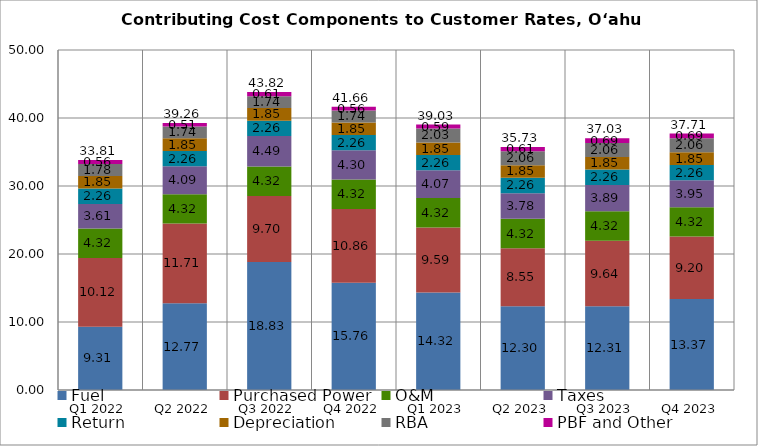
| Category | Fuel | Purchased Power | O&M | Taxes | Return | Depreciation | RBA | PBF and Other | Total |
|---|---|---|---|---|---|---|---|---|---|
| Q1 2022 | 9.305 | 10.122 | 4.324 | 3.606 | 2.262 | 1.852 | 1.777 | 0.562 | 33.811 |
| Q2 2022 | 12.769 | 11.712 | 4.324 | 4.09 | 2.262 | 1.852 | 1.739 | 0.51 | 39.258 |
| Q3 2022 | 18.83 | 9.702 | 4.324 | 4.495 | 2.262 | 1.852 | 1.739 | 0.612 | 43.815 |
| Q4 2022 | 15.756 | 10.86 | 4.324 | 4.303 | 2.262 | 1.852 | 1.739 | 0.56 | 41.656 |
| Q1 2023 | 14.32 | 9.587 | 4.324 | 4.07 | 2.262 | 1.852 | 2.026 | 0.592 | 39.034 |
| Q2 2023 | 12.302 | 8.545 | 4.324 | 3.776 | 2.262 | 1.852 | 2.06 | 0.606 | 35.727 |
| Q3 2023 | 12.309 | 9.64 | 4.324 | 3.89 | 2.262 | 1.852 | 2.06 | 0.692 | 37.03 |
| Q4 2023 | 13.369 | 9.198 | 4.324 | 3.95 | 2.262 | 1.852 | 2.06 | 0.691 | 37.707 |